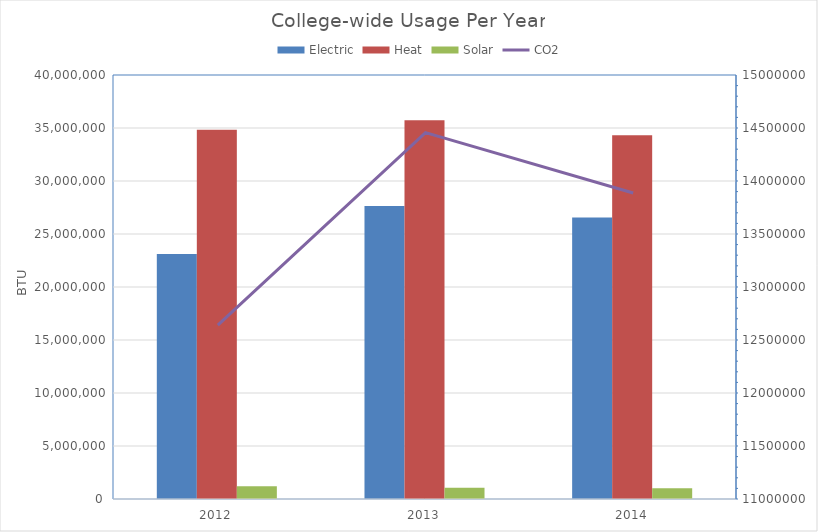
| Category | Electric | Heat | Solar |
|---|---|---|---|
| 2012.0 | 23118145 | 34840627 | 1210625 |
| 2013.0 | 27632849 | 35723781 | 1070057 |
| 2014.0 | 26545779 | 34310248 | 1010711 |